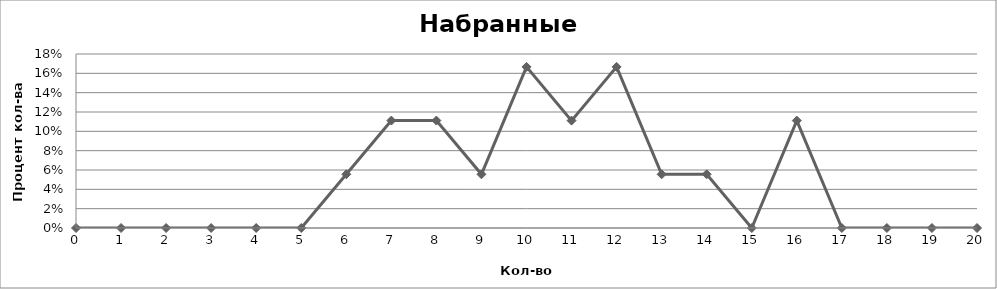
| Category | Series 0 |
|---|---|
| 0.0 | 0 |
| 1.0 | 0 |
| 2.0 | 0 |
| 3.0 | 0 |
| 4.0 | 0 |
| 5.0 | 0 |
| 6.0 | 0.056 |
| 7.0 | 0.111 |
| 8.0 | 0.111 |
| 9.0 | 0.056 |
| 10.0 | 0.167 |
| 11.0 | 0.111 |
| 12.0 | 0.167 |
| 13.0 | 0.056 |
| 14.0 | 0.056 |
| 15.0 | 0 |
| 16.0 | 0.111 |
| 17.0 | 0 |
| 18.0 | 0 |
| 19.0 | 0 |
| 20.0 | 0 |